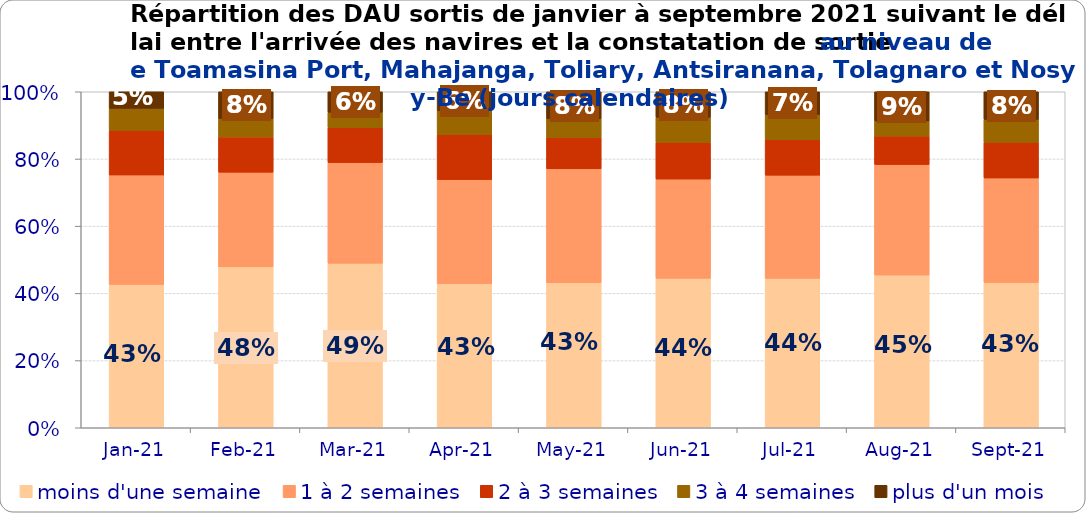
| Category | moins d'une semaine | 1 à 2 semaines | 2 à 3 semaines | 3 à 4 semaines | plus d'un mois |
|---|---|---|---|---|---|
| 2021-01-01 | 0.426 | 0.326 | 0.133 | 0.065 | 0.049 |
| 2021-02-01 | 0.479 | 0.282 | 0.105 | 0.054 | 0.08 |
| 2021-03-01 | 0.49 | 0.299 | 0.103 | 0.047 | 0.061 |
| 2021-04-01 | 0.429 | 0.31 | 0.134 | 0.072 | 0.056 |
| 2021-05-01 | 0.432 | 0.339 | 0.092 | 0.056 | 0.081 |
| 2021-06-01 | 0.445 | 0.295 | 0.109 | 0.075 | 0.076 |
| 2021-07-01 | 0.445 | 0.307 | 0.105 | 0.075 | 0.068 |
| 2021-08-01 | 0.454 | 0.329 | 0.085 | 0.045 | 0.087 |
| 2021-09-01 | 0.432 | 0.311 | 0.106 | 0.068 | 0.082 |